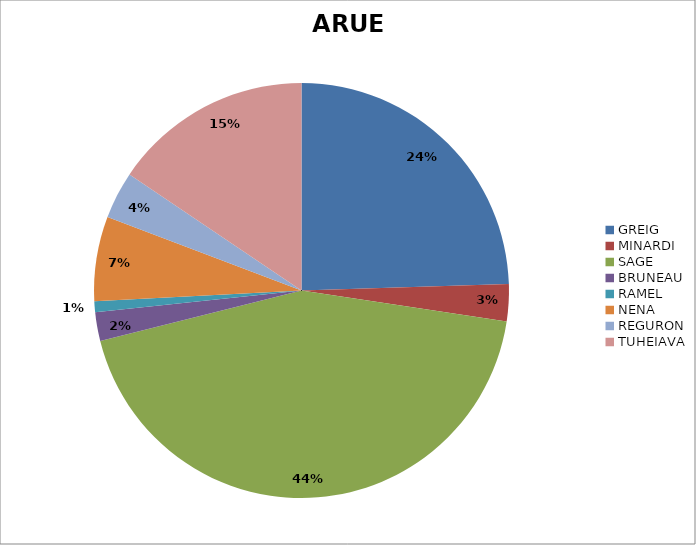
| Category | ARUE |
|---|---|
| GREIG | 613 |
| MINARDI | 72 |
| SAGE | 1093 |
| BRUNEAU | 56 |
| RAMEL | 21 |
| NENA | 165 |
| REGURON | 92 |
| TUHEIAVA | 389 |